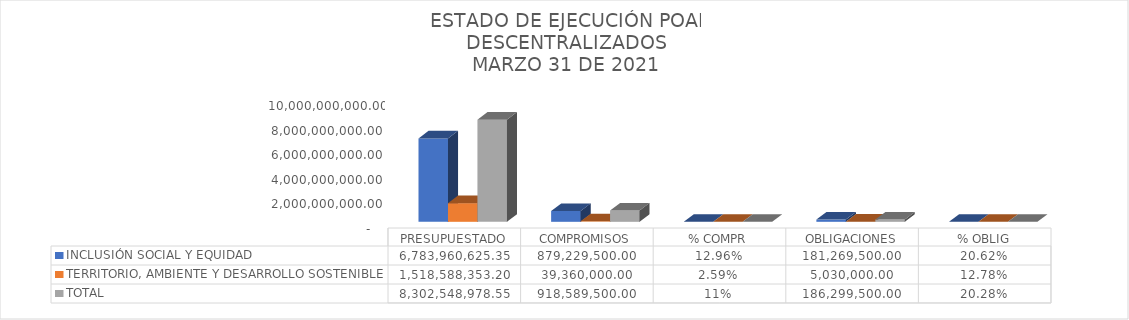
| Category | INCLUSIÓN SOCIAL Y EQUIDAD  | TERRITORIO, AMBIENTE Y DESARROLLO SOSTENIBLE  | TOTAL |
|---|---|---|---|
| PRESUPUESTADO | 6783960625.35 | 1518588353.2 | 8302548978.55 |
| COMPROMISOS | 879229500 | 39360000 | 918589500 |
| % COMPR | 0.13 | 0.026 | 0.111 |
| OBLIGACIONES | 181269500 | 5030000 | 186299500 |
| % OBLIG | 0.206 | 0.128 | 0.203 |